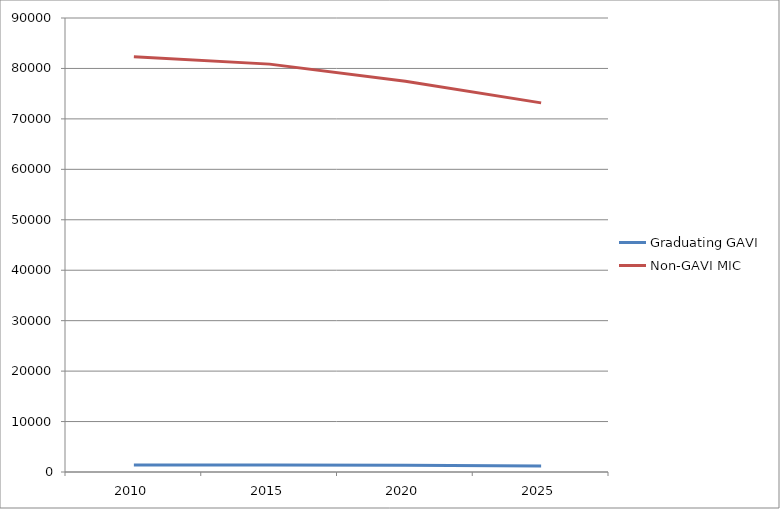
| Category | Graduating GAVI | Non-GAVI MIC |
|---|---|---|
| 2010.0 | 1364 | 82335 |
| 2015.0 | 1408 | 80857 |
| 2020.0 | 1322 | 77458 |
| 2025.0 | 1190 | 73178 |